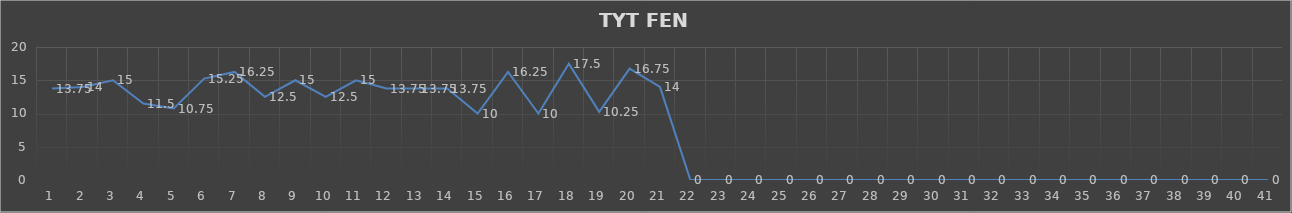
| Category | Series 0 |
|---|---|
| 0 | 13.75 |
| 1 | 14 |
| 2 | 15 |
| 3 | 11.5 |
| 4 | 10.75 |
| 5 | 15.25 |
| 6 | 16.25 |
| 7 | 12.5 |
| 8 | 15 |
| 9 | 12.5 |
| 10 | 15 |
| 11 | 13.75 |
| 12 | 13.75 |
| 13 | 13.75 |
| 14 | 10 |
| 15 | 16.25 |
| 16 | 10 |
| 17 | 17.5 |
| 18 | 10.25 |
| 19 | 16.75 |
| 20 | 14 |
| 21 | 0 |
| 22 | 0 |
| 23 | 0 |
| 24 | 0 |
| 25 | 0 |
| 26 | 0 |
| 27 | 0 |
| 28 | 0 |
| 29 | 0 |
| 30 | 0 |
| 31 | 0 |
| 32 | 0 |
| 33 | 0 |
| 34 | 0 |
| 35 | 0 |
| 36 | 0 |
| 37 | 0 |
| 38 | 0 |
| 39 | 0 |
| 40 | 0 |